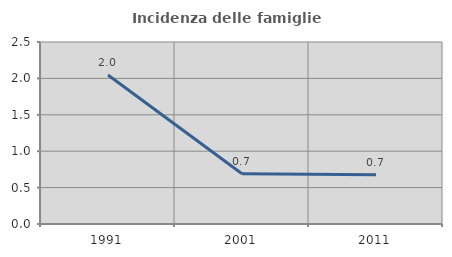
| Category | Incidenza delle famiglie numerose |
|---|---|
| 1991.0 | 2.046 |
| 2001.0 | 0.691 |
| 2011.0 | 0.677 |